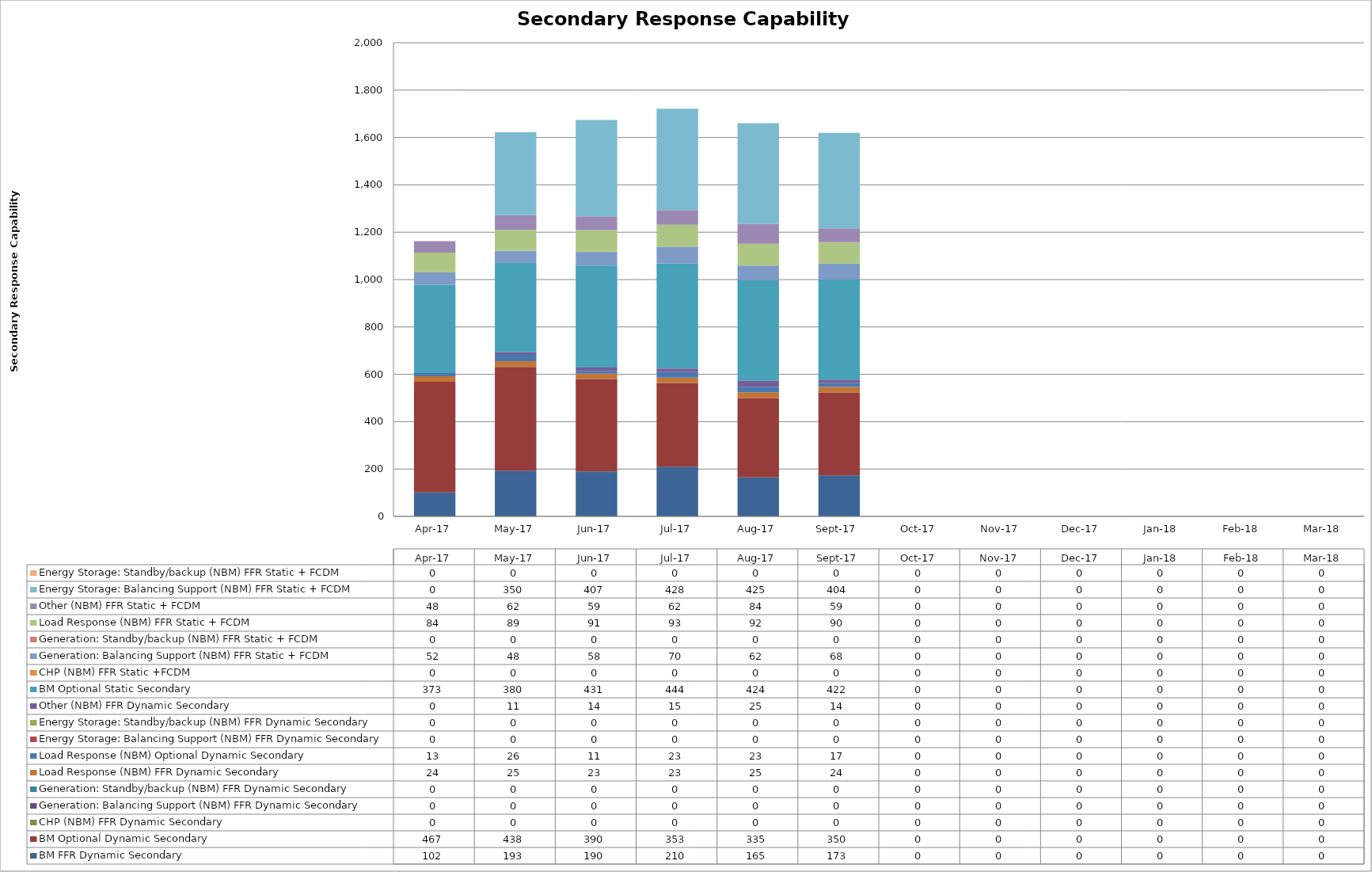
| Category | BM FFR Dynamic Secondary | BM Optional Dynamic Secondary | CHP (NBM) FFR Dynamic Secondary | Generation: Balancing Support (NBM) FFR Dynamic Secondary | Generation: Standby/backup (NBM) FFR Dynamic Secondary | Load Response (NBM) FFR Dynamic Secondary | Load Response (NBM) Optional Dynamic Secondary | Energy Storage: Balancing Support (NBM) FFR Dynamic Secondary | Energy Storage: Standby/backup (NBM) FFR Dynamic Secondary | Other (NBM) FFR Dynamic Secondary | BM Optional Static Secondary | CHP (NBM) FFR Static +FCDM | Generation: Balancing Support (NBM) FFR Static + FCDM | Generation: Standby/backup (NBM) FFR Static + FCDM | Load Response (NBM) FFR Static + FCDM | Other (NBM) FFR Static + FCDM | Energy Storage: Balancing Support (NBM) FFR Static + FCDM | Energy Storage: Standby/backup (NBM) FFR Static + FCDM |
|---|---|---|---|---|---|---|---|---|---|---|---|---|---|---|---|---|---|---|
| 2017-04-01 | 101.543 | 466.749 | 0 | 0 | 0 | 23.76 | 13.024 | 0 | 0 | 0 | 372.549 | 0 | 52.216 | 0 | 84.205 | 48.207 | 0 | 0 |
| 2017-05-01 | 193.299 | 438.015 | 0 | 0 | 0 | 24.552 | 26.176 | 0 | 0 | 10.98 | 380.139 | 0 | 48.038 | 0 | 88.761 | 61.564 | 350.182 | 0 |
| 2017-06-01 | 189.988 | 389.987 | 0 | 0 | 0 | 22.968 | 11.234 | 0 | 0 | 14.3 | 431.265 | 0 | 57.827 | 0 | 91.049 | 58.508 | 406.869 | 0 |
| 2017-07-01 | 210.065 | 353.165 | 0 | 0 | 0 | 22.968 | 23.497 | 0 | 0 | 14.78 | 444.341 | 0 | 69.784 | 0 | 92.938 | 62.251 | 427.83 | 0 |
| 2017-08-01 | 164.847 | 334.925 | 0 | 0 | 0 | 24.552 | 23.323 | 0 | 0 | 24.892 | 424.336 | 0 | 62.207 | 0 | 92.456 | 84.247 | 424.535 | 0 |
| 2017-09-01 | 173.418 | 349.699 | 0 | 0 | 0 | 23.76 | 16.56 | 0 | 0 | 14.322 | 421.987 | 0 | 68.005 | 0 | 89.96 | 58.55 | 403.614 | 0 |
| 2017-10-01 | 0 | 0 | 0 | 0 | 0 | 0 | 0 | 0 | 0 | 0 | 0 | 0 | 0 | 0 | 0 | 0 | 0 | 0 |
| 2017-11-01 | 0 | 0 | 0 | 0 | 0 | 0 | 0 | 0 | 0 | 0 | 0 | 0 | 0 | 0 | 0 | 0 | 0 | 0 |
| 2017-12-01 | 0 | 0 | 0 | 0 | 0 | 0 | 0 | 0 | 0 | 0 | 0 | 0 | 0 | 0 | 0 | 0 | 0 | 0 |
| 2018-01-01 | 0 | 0 | 0 | 0 | 0 | 0 | 0 | 0 | 0 | 0 | 0 | 0 | 0 | 0 | 0 | 0 | 0 | 0 |
| 2018-02-01 | 0 | 0 | 0 | 0 | 0 | 0 | 0 | 0 | 0 | 0 | 0 | 0 | 0 | 0 | 0 | 0 | 0 | 0 |
| 2018-03-01 | 0 | 0 | 0 | 0 | 0 | 0 | 0 | 0 | 0 | 0 | 0 | 0 | 0 | 0 | 0 | 0 | 0 | 0 |